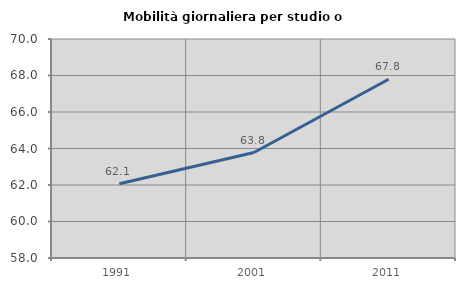
| Category | Mobilità giornaliera per studio o lavoro |
|---|---|
| 1991.0 | 62.069 |
| 2001.0 | 63.778 |
| 2011.0 | 67.798 |